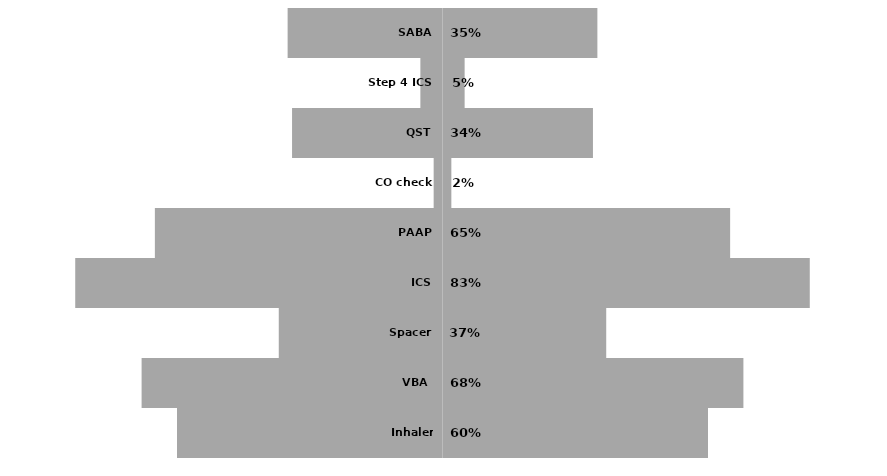
| Category | Series 0 | Series 1 |
|---|---|---|
| SABA | 0.35 | -0.35 |
| Step 4 ICS | 0.05 | -0.05 |
| QST | 0.34 | -0.34 |
| CO check | 0.02 | -0.02 |
| PAAP | 0.65 | -0.65 |
| ICS | 0.83 | -0.83 |
| Spacer | 0.37 | -0.37 |
| VBA  | 0.68 | -0.68 |
| Inhaler check | 0.6 | -0.6 |